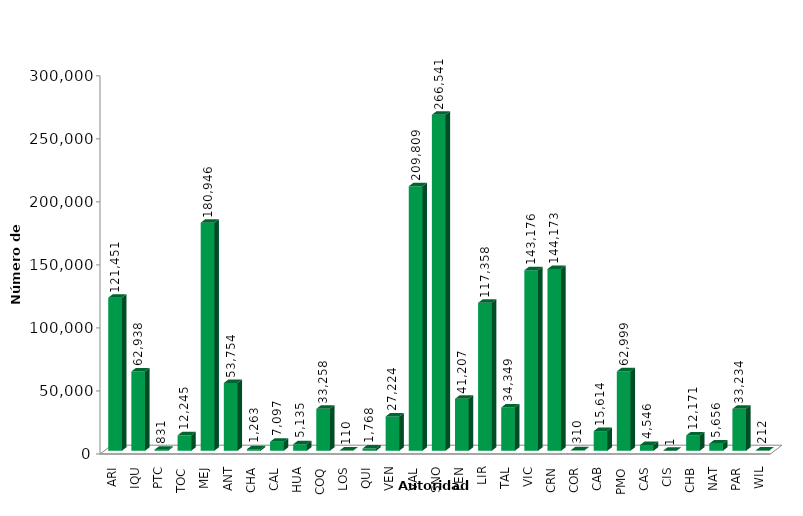
| Category | Series 0 |
|---|---|
| ARI | 121451 |
| IQU | 62938 |
| PTC | 831 |
| TOC | 12245 |
| MEJ | 180946 |
| ANT | 53754 |
| CHA | 1263 |
| CAL | 7097 |
| HUA | 5135 |
| COQ | 33258 |
| LOS | 110 |
| QUI | 1768 |
| VEN | 27224 |
| VAL | 209809 |
| SNO | 266541 |
| PEN | 41207 |
| LIR | 117358 |
| TAL | 34349 |
| VIC | 143176 |
| CRN | 144173 |
| COR | 310 |
| CAB | 15614 |
| PMO | 62999 |
| CAS | 4546 |
| CIS | 1 |
| CHB | 12171 |
| NAT | 5656 |
| PAR | 33234 |
| WIL | 212 |